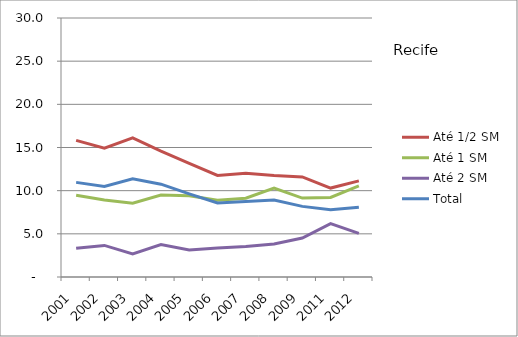
| Category | Até 1/2 SM | Até 1 SM | Até 2 SM | Total |
|---|---|---|---|---|
| 2001.0 | 15.82 | 9.46 | 3.33 | 10.96 |
| 2002.0 | 14.91 | 8.93 | 3.66 | 10.48 |
| 2003.0 | 16.12 | 8.55 | 2.68 | 11.38 |
| 2004.0 | 14.58 | 9.5 | 3.75 | 10.75 |
| 2005.0 | 13.15 | 9.41 | 3.12 | 9.63 |
| 2006.0 | 11.76 | 8.88 | 3.35 | 8.58 |
| 2007.0 | 12.01 | 9.13 | 3.53 | 8.74 |
| 2008.0 | 11.76 | 10.3 | 3.83 | 8.92 |
| 2009.0 | 11.59 | 9.14 | 4.52 | 8.18 |
| 2011.0 | 10.3 | 9.21 | 6.18 | 7.78 |
| 2012.0 | 11.13 | 10.55 | 5.06 | 8.09 |